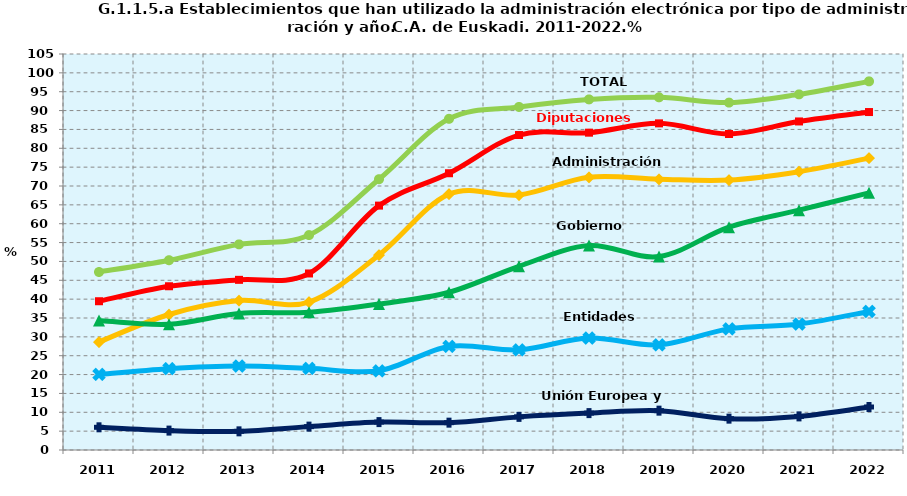
| Category | TOTAL | Diputaciones Forales | Administración Central | Gobierno Vasco | Entidades Locales | Unión Europea y Otros |
|---|---|---|---|---|---|---|
| 2011.0 | 47.195 | 39.446 | 28.619 | 34.347 | 20.063 | 6.017 |
| 2012.0 | 50.321 | 43.417 | 35.926 | 33.339 | 21.568 | 5.144 |
| 2013.0 | 54.524 | 45.118 | 39.622 | 36.207 | 22.264 | 4.948 |
| 2014.0 | 56.986 | 46.807 | 39.221 | 36.539 | 21.658 | 6.198 |
| 2015.0 | 71.8 | 64.8 | 51.7 | 38.7 | 21 | 7.4 |
| 2016.0 | 87.813 | 73.385 | 67.853 | 41.82 | 27.461 | 7.249 |
| 2017.0 | 90.959 | 83.514 | 67.612 | 48.718 | 26.543 | 8.784 |
| 2018.0 | 92.961 | 84.142 | 72.311 | 54.229 | 29.694 | 9.782 |
| 2019.0 | 93.517 | 86.609 | 71.787 | 51.305 | 27.87 | 10.432 |
| 2020.0 | 92.114 | 83.794 | 71.565 | 59.083 | 32.123 | 8.311 |
| 2021.0 | 94.294 | 87.114 | 73.798 | 63.597 | 33.395 | 8.911 |
| 2022.0 | 97.747 | 89.61 | 77.383 | 68.196 | 36.727 | 11.402 |